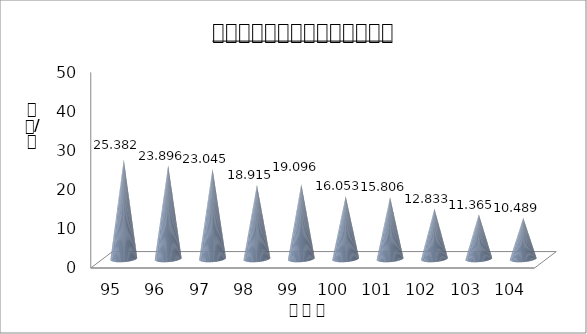
| Category | Series 0 |
|---|---|
| 95.0 | 25.382 |
| 96.0 | 23.896 |
| 97.0 | 23.045 |
| 98.0 | 18.915 |
| 99.0 | 19.096 |
| 100.0 | 16.053 |
| 101.0 | 15.806 |
| 102.0 | 12.833 |
| 103.0 | 11.365 |
| 104.0 | 10.489 |